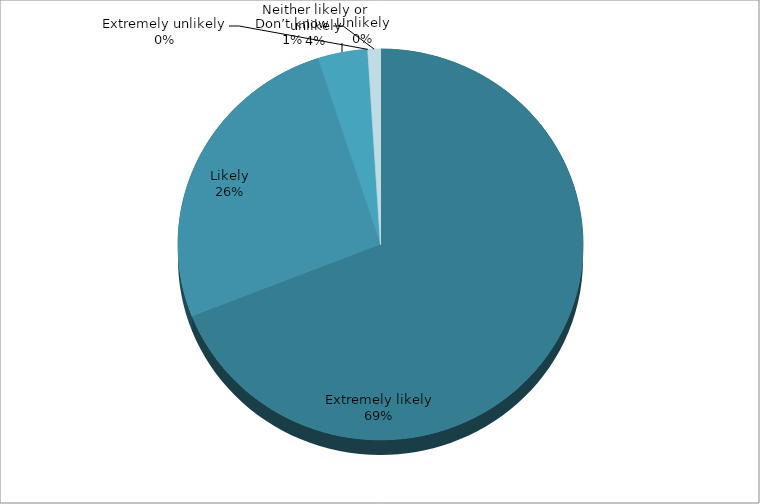
| Category | Series 0 |
|---|---|
| Extremely likely | 69 |
| Likely | 26 |
| Neither likely or unlikely | 4 |
| Unlikely | 0 |
| Extremely unlikely | 0 |
| Don’t know | 1 |